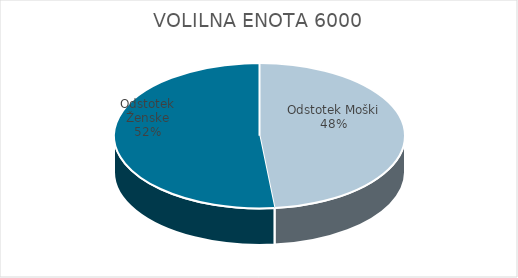
| Category | VOLILNA ENOTA 6000 | #REF! | Slovenija skupaj |
|---|---|---|---|
| Odstotek Moški | 25.52 |  | 25.28 |
| Odstotek Ženske | 27.25 |  | 27.73 |